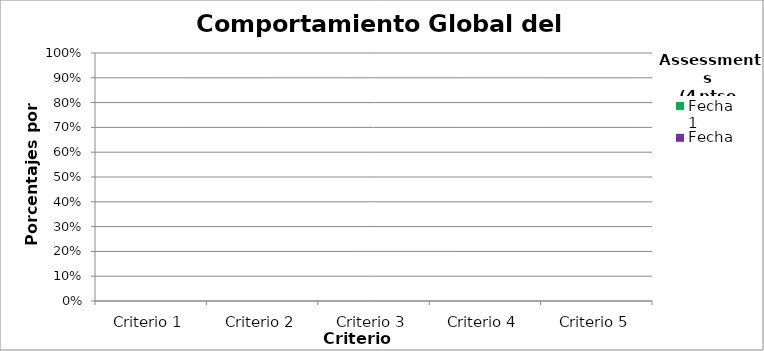
| Category | Fecha 1 | Fecha 2 |
|---|---|---|
| Criterio 1 | 0 | 0 |
| Criterio 2 | 0 | 0 |
| Criterio 3 | 0 | 0 |
| Criterio 4 | 0 | 0 |
| Criterio 5 | 0 | 0 |